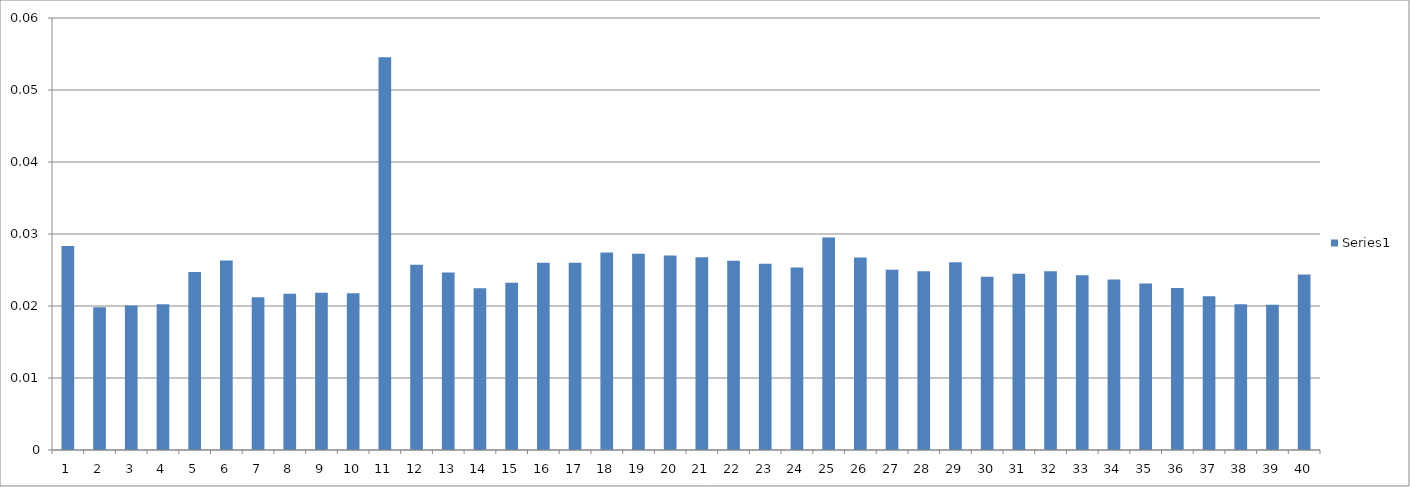
| Category | Series 0 |
|---|---|
| 0 | 0.028 |
| 1 | 0.02 |
| 2 | 0.02 |
| 3 | 0.02 |
| 4 | 0.025 |
| 5 | 0.026 |
| 6 | 0.021 |
| 7 | 0.022 |
| 8 | 0.022 |
| 9 | 0.022 |
| 10 | 0.055 |
| 11 | 0.026 |
| 12 | 0.025 |
| 13 | 0.022 |
| 14 | 0.023 |
| 15 | 0.026 |
| 16 | 0.026 |
| 17 | 0.027 |
| 18 | 0.027 |
| 19 | 0.027 |
| 20 | 0.027 |
| 21 | 0.026 |
| 22 | 0.026 |
| 23 | 0.025 |
| 24 | 0.03 |
| 25 | 0.027 |
| 26 | 0.025 |
| 27 | 0.025 |
| 28 | 0.026 |
| 29 | 0.024 |
| 30 | 0.024 |
| 31 | 0.025 |
| 32 | 0.024 |
| 33 | 0.024 |
| 34 | 0.023 |
| 35 | 0.022 |
| 36 | 0.021 |
| 37 | 0.02 |
| 38 | 0.02 |
| 39 | 0.024 |